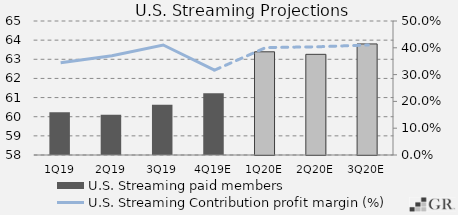
| Category | U.S. Streaming paid members |
|---|---|
|  1Q19  | 60.229 |
|  2Q19  | 60.103 |
|  3Q19  | 60.62 |
|  4Q19E  | 61.22 |
|  1Q20E  | 63.391 |
|  2Q20E  | 63.258 |
|  3Q20E  | 63.803 |